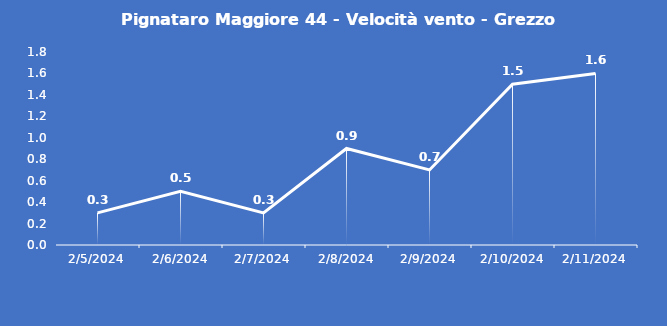
| Category | Pignataro Maggiore 44 - Velocità vento - Grezzo (m/s) |
|---|---|
| 2/5/24 | 0.3 |
| 2/6/24 | 0.5 |
| 2/7/24 | 0.3 |
| 2/8/24 | 0.9 |
| 2/9/24 | 0.7 |
| 2/10/24 | 1.5 |
| 2/11/24 | 1.6 |